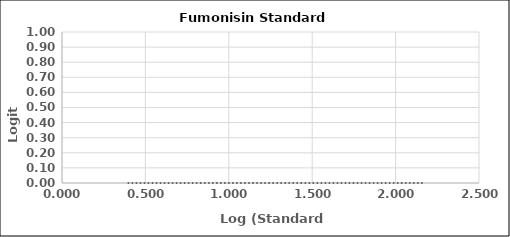
| Category | Series 0 |
|---|---|
| 0.3979400086720376 | 0 |
| 0.8750612633917001 | 0 |
| 1.3010299956639813 | 0 |
| 1.6989700043360187 | 0 |
| 2.1760912590556813 | 0 |